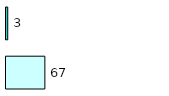
| Category | Series 0 | Series 1 |
|---|---|---|
| 0 | 67 | 3 |